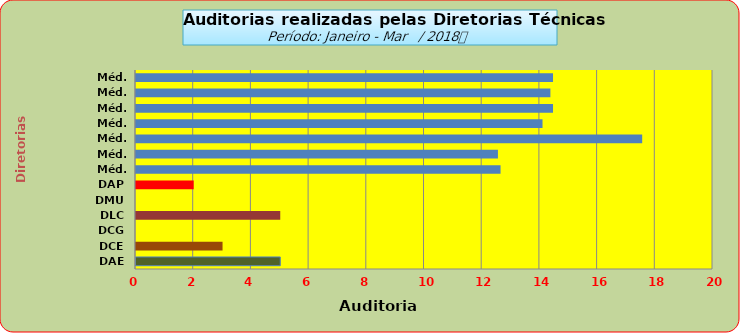
| Category | Series 0 |
|---|---|
| DAE | 5 |
| DCE | 3 |
| DCG | 0 |
| DLC | 5 |
| DMU | 0 |
| DAP | 2 |
| Méd. 2011 | 12.636 |
| Méd. 2012 | 12.545 |
| Méd. 2013 | 17.545 |
| Méd. 2014 | 14.091 |
| Méd. 2015 | 14.455 |
| Méd. 2016 | 14.364 |
| Méd. 2017 | 14.455 |